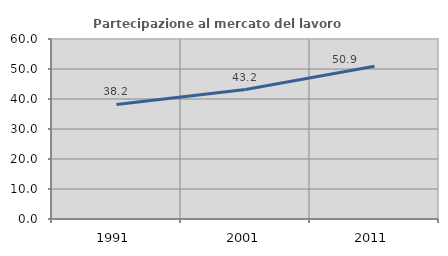
| Category | Partecipazione al mercato del lavoro  femminile |
|---|---|
| 1991.0 | 38.179 |
| 2001.0 | 43.161 |
| 2011.0 | 50.944 |